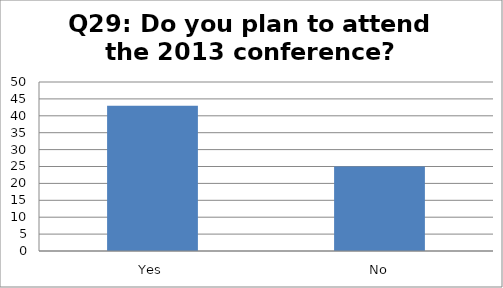
| Category | Series 0 |
|---|---|
| Yes | 43 |
| No | 25 |